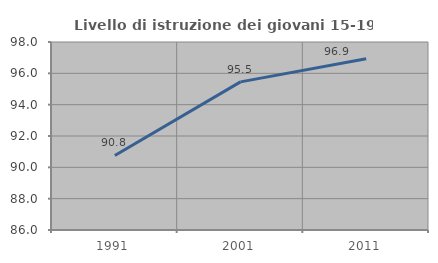
| Category | Livello di istruzione dei giovani 15-19 anni |
|---|---|
| 1991.0 | 90.759 |
| 2001.0 | 95.455 |
| 2011.0 | 96.93 |